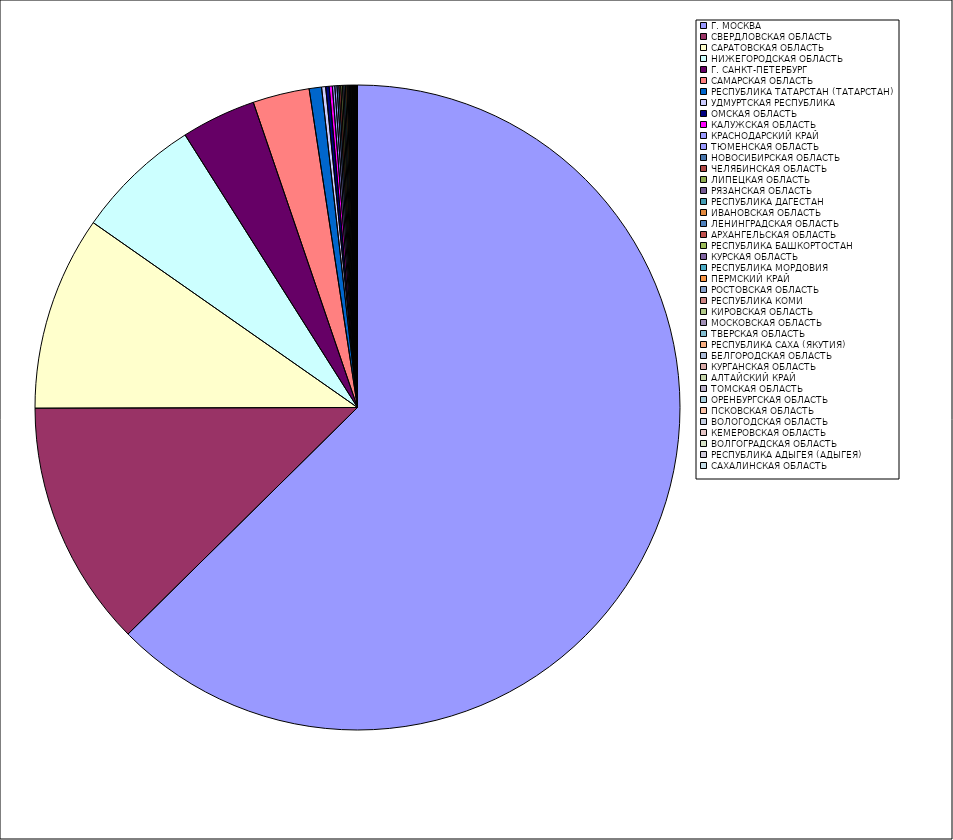
| Category | Оборот |
|---|---|
| Г. МОСКВА | 62.585 |
| СВЕРДЛОВСКАЯ ОБЛАСТЬ | 12.359 |
| САРАТОВСКАЯ ОБЛАСТЬ | 9.747 |
| НИЖЕГОРОДСКАЯ ОБЛАСТЬ | 6.306 |
| Г. САНКТ-ПЕТЕРБУРГ | 3.74 |
| САМАРСКАЯ ОБЛАСТЬ | 2.837 |
| РЕСПУБЛИКА ТАТАРСТАН (ТАТАРСТАН) | 0.619 |
| УДМУРТСКАЯ РЕСПУБЛИКА | 0.203 |
| ОМСКАЯ ОБЛАСТЬ | 0.174 |
| КАЛУЖСКАЯ ОБЛАСТЬ | 0.158 |
| КРАСНОДАРСКИЙ КРАЙ | 0.123 |
| ТЮМЕНСКАЯ ОБЛАСТЬ | 0.107 |
| НОВОСИБИРСКАЯ ОБЛАСТЬ | 0.095 |
| ЧЕЛЯБИНСКАЯ ОБЛАСТЬ | 0.09 |
| ЛИПЕЦКАЯ ОБЛАСТЬ | 0.085 |
| РЯЗАНСКАЯ ОБЛАСТЬ | 0.074 |
| РЕСПУБЛИКА ДАГЕСТАН | 0.074 |
| ИВАНОВСКАЯ ОБЛАСТЬ | 0.071 |
| ЛЕНИНГРАДСКАЯ ОБЛАСТЬ | 0.05 |
| АРХАНГЕЛЬСКАЯ ОБЛАСТЬ | 0.047 |
| РЕСПУБЛИКА БАШКОРТОСТАН | 0.037 |
| КУРСКАЯ ОБЛАСТЬ | 0.036 |
| РЕСПУБЛИКА МОРДОВИЯ | 0.035 |
| ПЕРМСКИЙ КРАЙ | 0.034 |
| РОСТОВСКАЯ ОБЛАСТЬ | 0.034 |
| РЕСПУБЛИКА КОМИ | 0.031 |
| КИРОВСКАЯ ОБЛАСТЬ | 0.029 |
| МОСКОВСКАЯ ОБЛАСТЬ | 0.027 |
| ТВЕРСКАЯ ОБЛАСТЬ | 0.025 |
| РЕСПУБЛИКА САХА (ЯКУТИЯ) | 0.019 |
| БЕЛГОРОДСКАЯ ОБЛАСТЬ | 0.018 |
| КУРГАНСКАЯ ОБЛАСТЬ | 0.016 |
| АЛТАЙСКИЙ КРАЙ | 0.016 |
| ТОМСКАЯ ОБЛАСТЬ | 0.014 |
| ОРЕНБУРГСКАЯ ОБЛАСТЬ | 0.013 |
| ПСКОВСКАЯ ОБЛАСТЬ | 0.009 |
| ВОЛОГОДСКАЯ ОБЛАСТЬ | 0.009 |
| КЕМЕРОВСКАЯ ОБЛАСТЬ | 0.007 |
| ВОЛГОГРАДСКАЯ ОБЛАСТЬ | 0.007 |
| РЕСПУБЛИКА АДЫГЕЯ (АДЫГЕЯ) | 0.007 |
| САХАЛИНСКАЯ ОБЛАСТЬ | 0.006 |